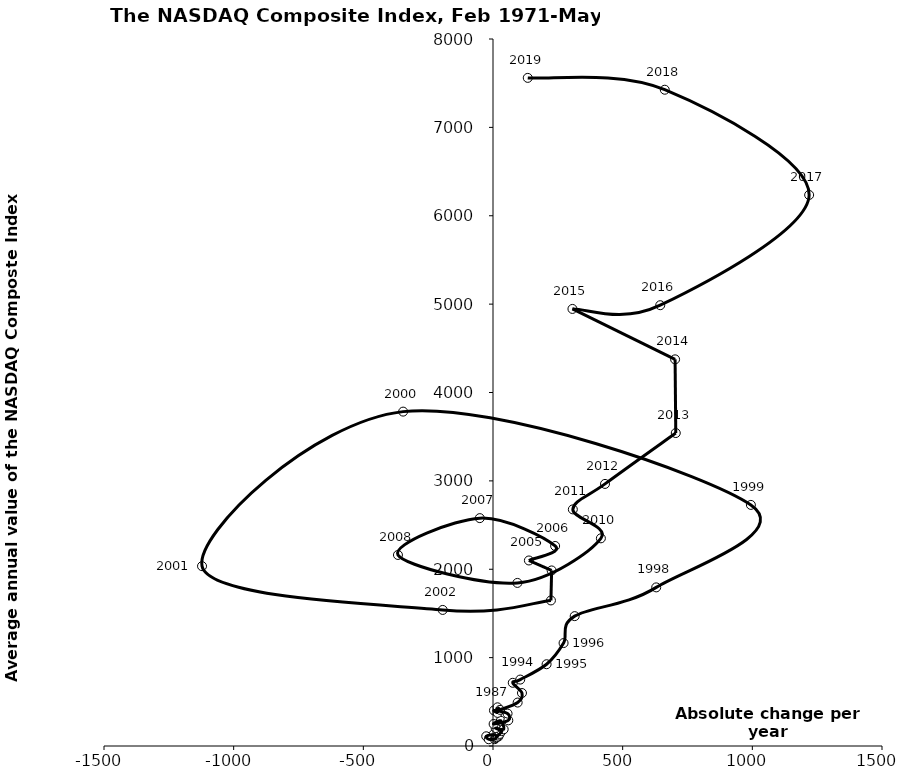
| Category | Series 0 |
|---|---|
| 21.084823152803637 | 107.442 |
| 1.2555333749220168 | 128.527 |
| -26.11986803773052 | 109.953 |
| -16.374452286843606 | 76.287 |
| 6.80561264822137 | 77.204 |
| 10.753083239224544 | 89.898 |
| 13.813508140410292 | 98.71 |
| 18.93221320346322 | 117.525 |
| 25.541630199510642 | 136.575 |
| 33.28944664031617 | 168.608 |
| 10.184367588932716 | 203.153 |
| 41.14005928853766 | 188.977 |
| 29.956739130434826 | 285.434 |
| 2.4085189629209935 | 248.891 |
| 59.03847826086964 | 290.251 |
| 56.16142174854133 | 366.968 |
| 3.733715415019759 | 402.573 |
| 17.613935394315916 | 374.435 |
| 17.370928853754833 | 437.801 |
| 26.942981601731475 | 409.177 |
| 95.0405377205818 | 491.687 |
| 111.7342094861661 | 599.258 |
| 76.19794806899091 | 715.156 |
| 105.01614224543584 | 751.654 |
| 206.6471109861268 | 925.188 |
| 272.1500830510061 | 1164.948 |
| 314.9794763154606 | 1469.488 |
| 629.3288852029627 | 1794.907 |
| 994.3831746031748 | 2728.146 |
| -346.57493215565853 | 3783.673 |
| -1121.9709325396825 | 2034.996 |
| -193.91457181259602 | 1539.731 |
| 223.39702380952428 | 1647.167 |
| 226.0747023809521 | 1986.526 |
| 138.442222143172 | 2099.316 |
| 239.57515201100318 | 2263.41 |
| -50.88148205596508 | 2578.467 |
| -366.5408266141777 | 2161.647 |
| 94.1232678493011 | 1845.385 |
| 416.0278968253971 | 2349.894 |
| 307.8327941269845 | 2677.441 |
| 431.9256349206346 | 2965.559 |
| 704.7722257142834 | 3541.292 |
| 702.1307738095231 | 4375.104 |
| 306.3446626984146 | 4945.554 |
| 644.8726565167922 | 4987.793 |
| 1219.0823902327184 | 6235.299 |
| 662.3540079941959 | 7425.958 |
| 134.0492231597109 | 7560.007 |